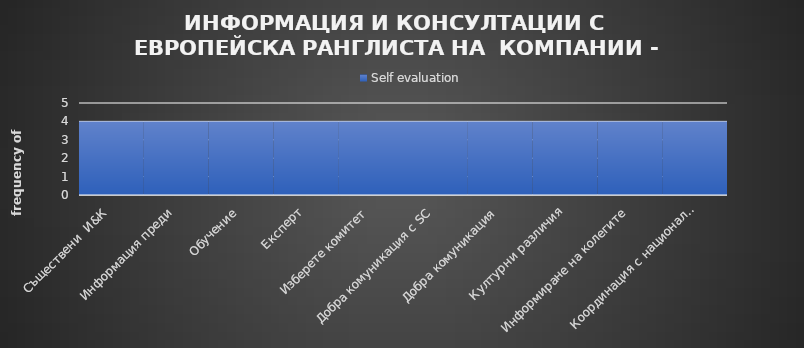
| Category | Self evaluation |
|---|---|
| Съществени  И&К | 4 |
| Информация преди | 4 |
| Обучение | 4 |
| Експерт | 4 |
| Изберете комитет | 4 |
| Добра комуникация с SC | 4 |
| Добра комуникация | 4 |
| Културни различия | 4 |
| Информиране на колегите | 4 |
| Координация с национални И & В | 4 |